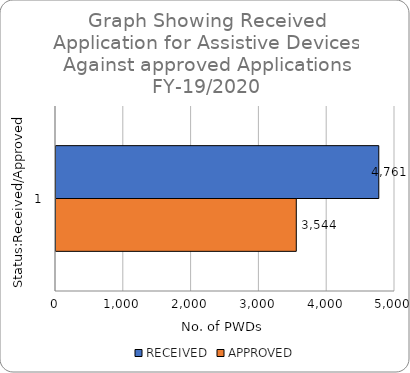
| Category | RECEIVED  | APPROVED |
|---|---|---|
| 0 | 4761 | 3544 |